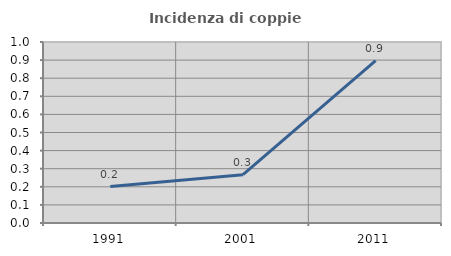
| Category | Incidenza di coppie miste |
|---|---|
| 1991.0 | 0.201 |
| 2001.0 | 0.267 |
| 2011.0 | 0.897 |